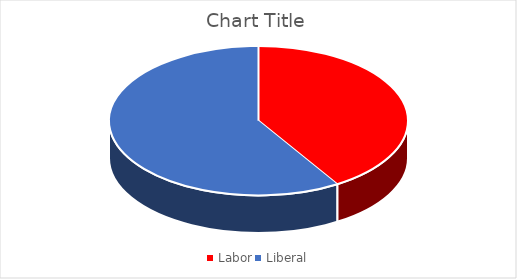
| Category | Series 0 |
|---|---|
| Labor | 7 |
| Liberal | 10 |